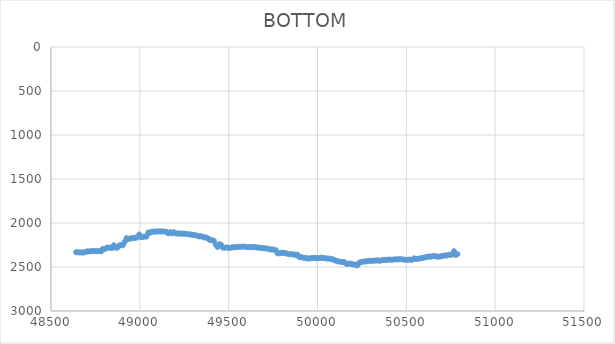
| Category | BOTTOM |
|---|---|
| 48641.3108 | 2332.74 |
| 48648.4446 | 2332.74 |
| 48658.6841 | 2334.14 |
| 48668.9242 | 2334.14 |
| 48679.1642 | 2335.55 |
| 48689.4043 | 2332.74 |
| 48699.6443 | 2324.29 |
| 48709.8844 | 2322.88 |
| 48720.1244 | 2322.88 |
| 48730.3645 | 2318.66 |
| 48740.6046 | 2318.66 |
| 48750.8446 | 2320.07 |
| 48761.0847 | 2320.07 |
| 48771.3247 | 2318.66 |
| 48781.5648 | 2322.88 |
| 48791.8049 | 2293.32 |
| 48802.0449 | 2297.55 |
| 48812.285 | 2282.06 |
| 48822.525 | 2279.25 |
| 48832.7651 | 2280.65 |
| 48843.0052 | 2283.47 |
| 48853.2452 | 2252.5 |
| 48863.4853 | 2280.65 |
| 48873.7253 | 2280.65 |
| 48883.9654 | 2253.91 |
| 48894.2055 | 2252.5 |
| 48904.4455 | 2252.5 |
| 48914.6856 | 2214.5 |
| 48924.9256 | 2172.27 |
| 48935.1657 | 2182.12 |
| 48945.4058 | 2176.49 |
| 48955.6458 | 2172.27 |
| 48965.8859 | 2172.27 |
| 48976.1259 | 2166.64 |
| 48986.366 | 2163.82 |
| 48996.6061 | 2130.04 |
| 49006.8461 | 2161.01 |
| 49017.0862 | 2158.19 |
| 49027.3262 | 2153.97 |
| 49037.5663 | 2153.97 |
| 49047.8064 | 2107.52 |
| 49058.0464 | 2110.33 |
| 49068.2865 | 2099.07 |
| 49078.5265 | 2099.07 |
| 49088.7666 | 2096.26 |
| 49099.0067 | 2096.26 |
| 49109.2467 | 2094.85 |
| 49119.4868 | 2096.26 |
| 49129.7268 | 2096.26 |
| 49139.9669 | 2097.66 |
| 49150.207 | 2101.89 |
| 49160.447 | 2117.37 |
| 49170.6871 | 2103.3 |
| 49180.9271 | 2117.37 |
| 49191.1672 | 2104.7 |
| 49201.4073 | 2118.78 |
| 49211.6473 | 2118.78 |
| 49221.8874 | 2121.59 |
| 49232.1274 | 2118.78 |
| 49242.3675 | 2121.59 |
| 49252.6076 | 2121.59 |
| 49262.8476 | 2125.82 |
| 49273.0877 | 2127.22 |
| 49283.3277 | 2130.04 |
| 49293.5678 | 2134.26 |
| 49303.8079 | 2135.67 |
| 49314.0479 | 2139.89 |
| 49324.288 | 2145.52 |
| 49334.528 | 2152.56 |
| 49344.7681 | 2149.75 |
| 49355.0082 | 2158.19 |
| 49365.2482 | 2165.23 |
| 49375.4883 | 2165.23 |
| 49385.7283 | 2177.9 |
| 49395.9684 | 2194.79 |
| 49406.2084 | 2194.79 |
| 49416.4485 | 2201.83 |
| 49426.6886 | 2245.46 |
| 49436.9286 | 2272.21 |
| 49447.1687 | 2239.83 |
| 49457.4087 | 2248.28 |
| 49467.6488 | 2280.65 |
| 49477.8889 | 2280.65 |
| 49488.1289 | 2277.84 |
| 49498.369 | 2282.06 |
| 49508.609 | 2283.47 |
| 49518.8491 | 2276.43 |
| 49529.0892 | 2277.84 |
| 49539.3292 | 2272.21 |
| 49549.5693 | 2272.21 |
| 49559.8093 | 2270.8 |
| 49570.0494 | 2269.39 |
| 49580.2895 | 2269.39 |
| 49590.5295 | 2267.99 |
| 49600.7696 | 2273.62 |
| 49611.0096 | 2273.62 |
| 49621.2497 | 2272.21 |
| 49631.4898 | 2275.02 |
| 49641.7298 | 2275.02 |
| 49651.9699 | 2275.02 |
| 49662.2099 | 2279.25 |
| 49672.45 | 2280.65 |
| 49682.6901 | 2283.47 |
| 49692.9301 | 2283.47 |
| 49703.1702 | 2289.1 |
| 49713.4102 | 2289.1 |
| 49723.6503 | 2294.73 |
| 49733.8904 | 2300.36 |
| 49744.1304 | 2300.36 |
| 49754.3705 | 2303.18 |
| 49764.6105 | 2308.81 |
| 49774.8506 | 2345.41 |
| 49785.0907 | 2344 |
| 49795.3307 | 2338.37 |
| 49805.5708 | 2338.37 |
| 49815.8108 | 2341.18 |
| 49826.0509 | 2346.81 |
| 49836.291 | 2352.44 |
| 49846.531 | 2355.26 |
| 49856.7711 | 2353.85 |
| 49867.0111 | 2359.48 |
| 49877.2512 | 2362.3 |
| 49887.4913 | 2359.48 |
| 49897.7313 | 2389.04 |
| 49907.9714 | 2387.63 |
| 49918.2114 | 2393.26 |
| 49928.4515 | 2398.89 |
| 49938.6916 | 2398.89 |
| 49948.9316 | 2404.53 |
| 49959.1717 | 2401.71 |
| 49969.4117 | 2397.49 |
| 49979.6518 | 2396.08 |
| 49989.8919 | 2398.89 |
| 50000.1319 | 2398.89 |
| 50010.372 | 2398.89 |
| 50020.612 | 2393.26 |
| 50030.8521 | 2398.89 |
| 50041.0922 | 2398.89 |
| 50051.3322 | 2404.53 |
| 50061.5723 | 2404.53 |
| 50071.8123 | 2405.93 |
| 50082.0524 | 2411.56 |
| 50092.2925 | 2417.19 |
| 50102.5325 | 2428.45 |
| 50112.7726 | 2434.08 |
| 50123.0126 | 2438.31 |
| 50133.2527 | 2441.12 |
| 50143.4928 | 2445.35 |
| 50153.7328 | 2445.35 |
| 50163.9729 | 2466.46 |
| 50174.2129 | 2462.24 |
| 50184.453 | 2462.24 |
| 50194.6931 | 2467.87 |
| 50204.9331 | 2472.09 |
| 50215.1732 | 2474.91 |
| 50225.4132 | 2480.54 |
| 50235.6533 | 2449.57 |
| 50245.8934 | 2445.35 |
| 50256.1334 | 2439.72 |
| 50266.3735 | 2436.9 |
| 50276.6135 | 2435.49 |
| 50286.8536 | 2429.86 |
| 50297.0937 | 2428.45 |
| 50307.3337 | 2431.27 |
| 50317.5738 | 2427.05 |
| 50327.8138 | 2427.05 |
| 50338.0539 | 2424.23 |
| 50348.294 | 2429.86 |
| 50358.534 | 2424.23 |
| 50368.7741 | 2422.82 |
| 50379.0141 | 2418.6 |
| 50389.2542 | 2420.01 |
| 50399.4943 | 2415.79 |
| 50409.7343 | 2417.19 |
| 50419.9744 | 2417.19 |
| 50430.2144 | 2414.38 |
| 50440.4545 | 2412.97 |
| 50450.6945 | 2412.97 |
| 50460.9346 | 2411.56 |
| 50471.1747 | 2411.56 |
| 50481.4147 | 2415.79 |
| 50491.6548 | 2417.19 |
| 50501.8948 | 2418.6 |
| 50512.1349 | 2417.19 |
| 50522.375 | 2415.79 |
| 50532.615 | 2418.6 |
| 50542.8551 | 2401.71 |
| 50553.0951 | 2407.34 |
| 50563.3352 | 2407.34 |
| 50573.5753 | 2404.53 |
| 50583.8153 | 2398.89 |
| 50594.0554 | 2396.08 |
| 50604.2954 | 2390.45 |
| 50614.5355 | 2386.23 |
| 50624.7756 | 2382 |
| 50635.0156 | 2382 |
| 50645.2557 | 2379.19 |
| 50655.4957 | 2374.97 |
| 50665.7358 | 2377.78 |
| 50675.9759 | 2383.41 |
| 50686.2159 | 2382 |
| 50696.456 | 2377.78 |
| 50706.696 | 2372.15 |
| 50716.9361 | 2367.93 |
| 50727.1762 | 2370.74 |
| 50737.4162 | 2360.89 |
| 50747.6563 | 2360.89 |
| 50757.8963 | 2359.48 |
| 50768.1364 | 2320.07 |
| 50778.3765 | 2362.3 |
| 50787.5559 | 2353.85 |